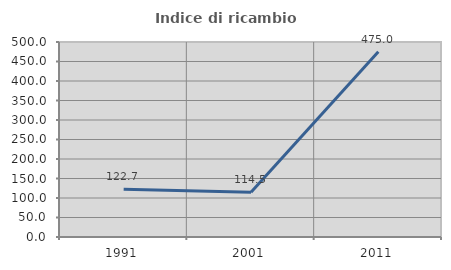
| Category | Indice di ricambio occupazionale  |
|---|---|
| 1991.0 | 122.727 |
| 2001.0 | 114.493 |
| 2011.0 | 475 |